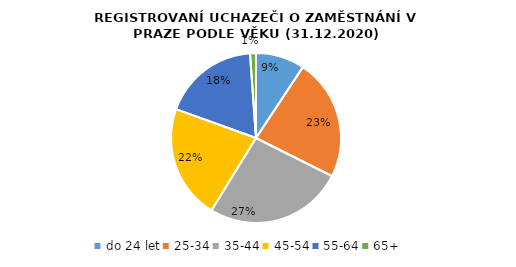
| Category | Praha |
|---|---|
| do 24 let | 2985 |
| 25-34 | 7413 |
| 35-44 | 8473 |
| 45-54 | 6977 |
| 55-64 | 5897 |
| 65+ | 362 |